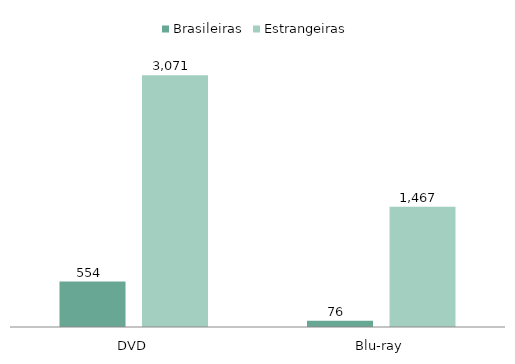
| Category | Brasileiras | Estrangeiras |
|---|---|---|
| DVD | 554 | 3071 |
| Blu-ray | 76 | 1467 |